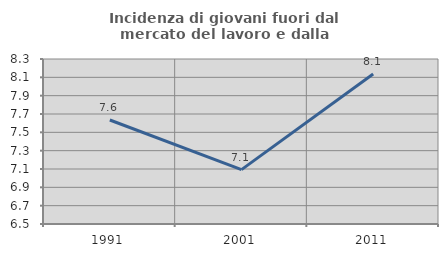
| Category | Incidenza di giovani fuori dal mercato del lavoro e dalla formazione  |
|---|---|
| 1991.0 | 7.635 |
| 2001.0 | 7.093 |
| 2011.0 | 8.136 |